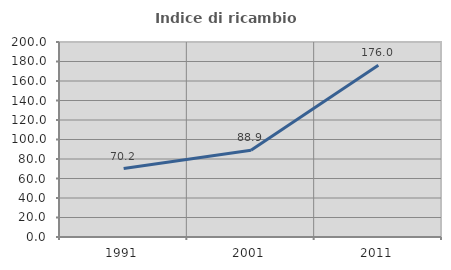
| Category | Indice di ricambio occupazionale  |
|---|---|
| 1991.0 | 70.168 |
| 2001.0 | 88.889 |
| 2011.0 | 176.033 |